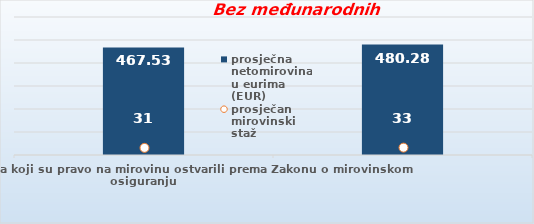
| Category | prosječna netomirovina u eurima (EUR) |
|---|---|
| Korisnici mirovina koji su pravo na mirovinu ostvarili prema Zakonu o mirovinskom osiguranju  | 467.53 |
| Korisnici koji su pravo na mirovinu PRVI PUT ostvarili u 2023. godini prema Zakonu o mirovinskom osiguranju - NOVI KORISNICI | 480.28 |